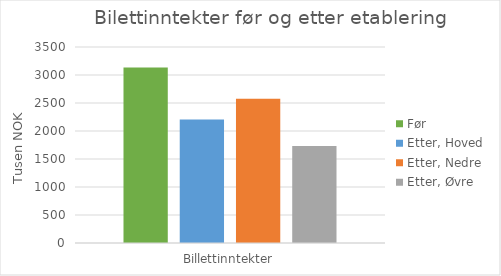
| Category | Før | Etter, Hoved | Etter, Nedre | Etter, Øvre |
|---|---|---|---|---|
| 0 | 3135 | 2204.655 | 2577.001 | 1732.067 |